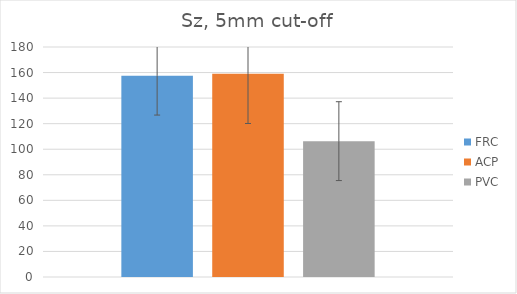
| Category | FRC | ACP | PVC |
|---|---|---|---|
| 0 | 157.5 | 159.125 | 106.325 |